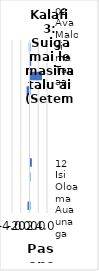
| Category | All items - m-m changes |
|---|---|
| 02 Ava Malosi ma Tapaa | -0.165 |
| 04 Fale, Suavai, Eletise, Kesi ma isi | 0.159 |
| 07 Femalagaiga | 2.625 |
| 01 Meaai ma Vaiinu | -0.679 |
| 11 Faleaiga | 0 |
| 09 Faafiafiaga ma Aganuu | 0 |
| 10 Aoaoga | 0 |
| 06 Soifua Maloloina | 0 |
| 05 Meafale, Mea Faigaleuga mo Faaleleia o Aiga | 0.319 |
| 03 Lavalava ma Seevae | -0.052 |
| 08 Fesootaiga | 0 |
| 12 Isi Oloa ma Auaunaga | -0.461 |